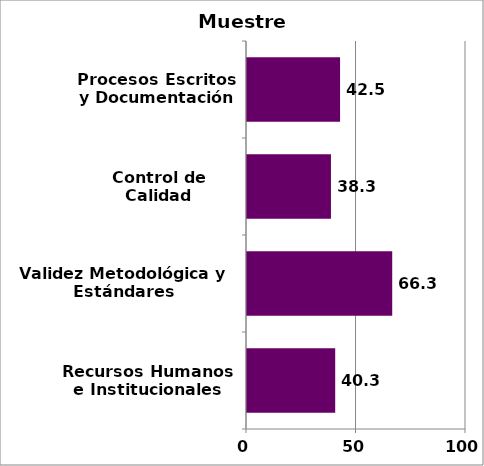
| Category | Series 0 |
|---|---|
| Recursos Humanos e Institucionales | 40.278 |
| Validez Metodológica y Estándares Internacionales | 66.31 |
| Control de Calidad | 38.333 |
| Procesos Escritos y Documentación | 42.5 |